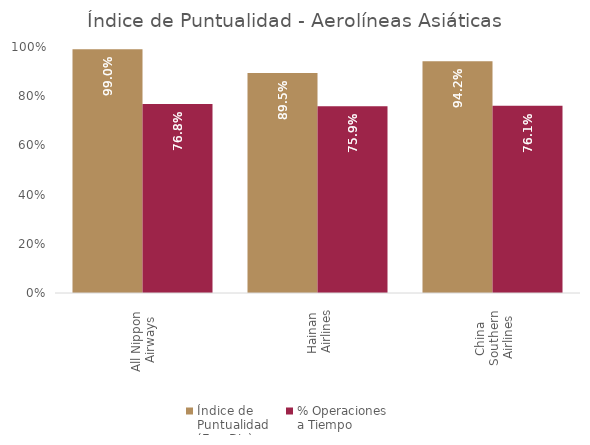
| Category | Índice de 
Puntualidad
(Ene-Dic) | % Operaciones 
a Tiempo |
|---|---|---|
| All Nippon 
Airways | 0.99 | 0.768 |
| Hainan 
Airlines | 0.895 | 0.759 |
| China 
Southern 
Airlines | 0.942 | 0.761 |